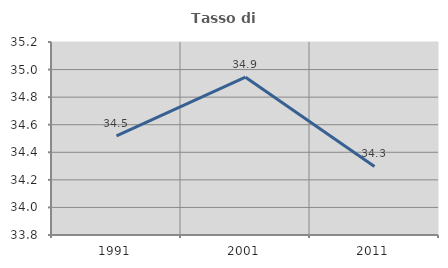
| Category | Tasso di occupazione   |
|---|---|
| 1991.0 | 34.52 |
| 2001.0 | 34.945 |
| 2011.0 | 34.297 |